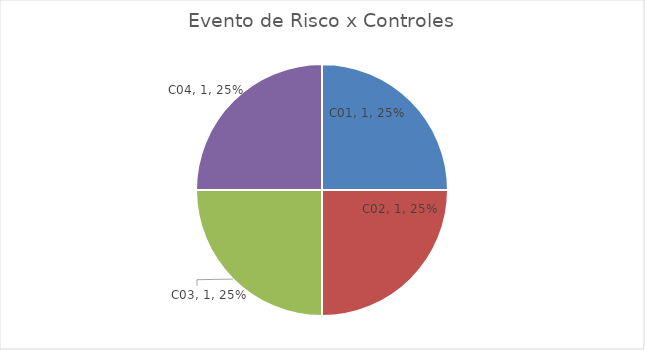
| Category | Series 0 |
|---|---|
| C01 | 1 |
| C02 | 1 |
| C03 | 1 |
| C04 | 1 |